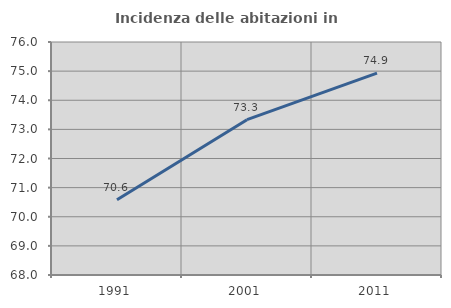
| Category | Incidenza delle abitazioni in proprietà  |
|---|---|
| 1991.0 | 70.585 |
| 2001.0 | 73.333 |
| 2011.0 | 74.933 |